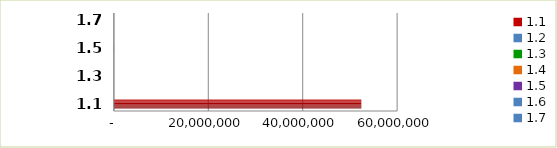
| Category | Series 0 |
|---|---|
| 1.1 | 52419182.2 |
| 1.2 | 0 |
| 1.3 | 0 |
| 1.4 | 0 |
| 1.5 | 30000 |
| 1.6 | 0 |
| 1.7 | 0 |